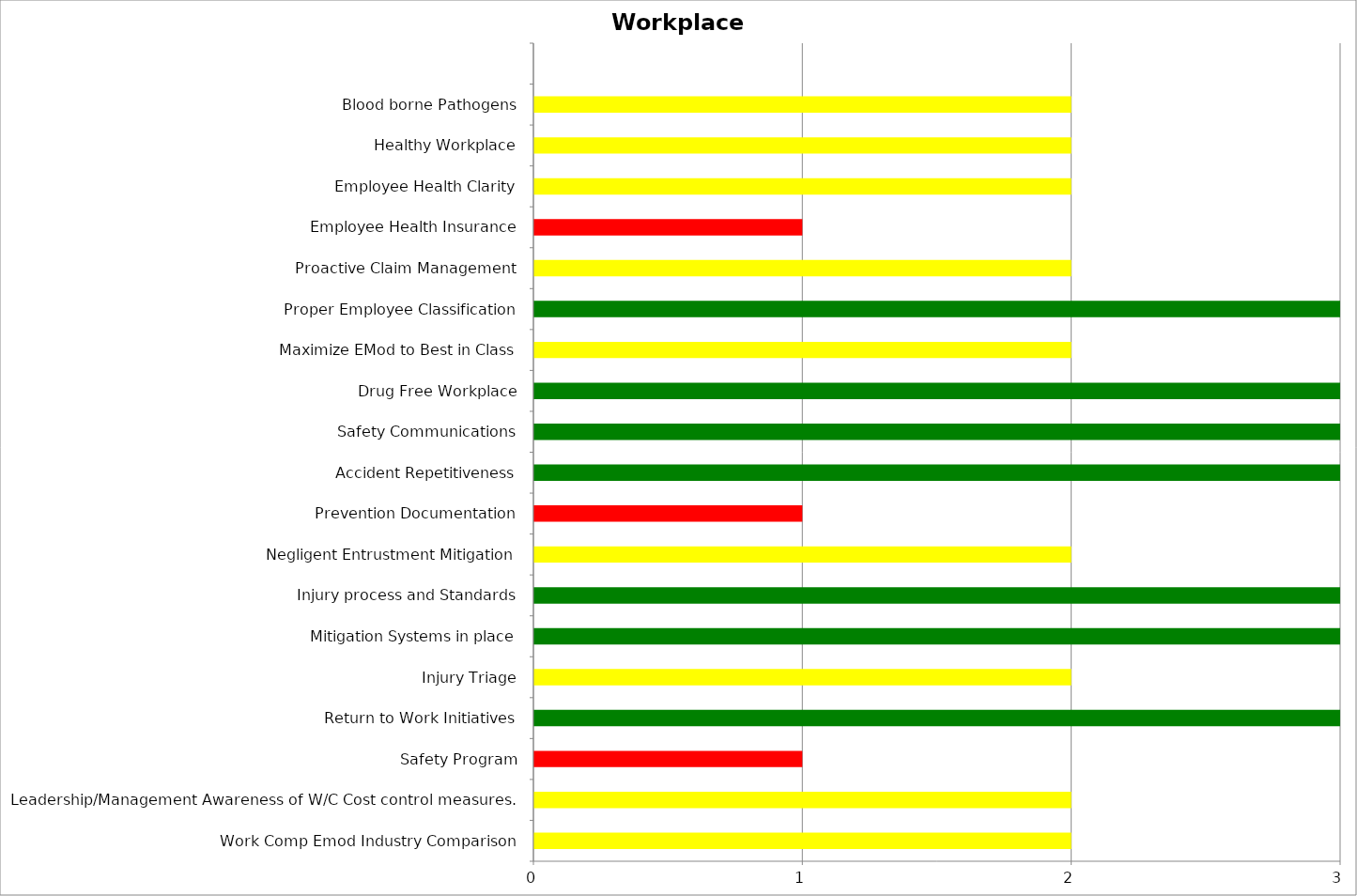
| Category | Low | Medium | High |
|---|---|---|---|
| Work Comp Emod Industry Comparison | 0 | 2 | 0 |
| Leadership/Management Awareness of W/C Cost control measures. | 0 | 2 | 0 |
| Safety Program | 0 | 0 | 1 |
| Return to Work Initiatives | 3 | 0 | 0 |
| Injury Triage | 0 | 2 | 0 |
| Mitigation Systems in place | 3 | 0 | 0 |
| Injury process and Standards | 3 | 0 | 0 |
| Negligent Entrustment Mitigation | 0 | 2 | 0 |
| Prevention Documentation | 0 | 0 | 1 |
| Accident Repetitiveness | 3 | 0 | 0 |
| Safety Communications | 3 | 0 | 0 |
| Drug Free Workplace | 3 | 0 | 0 |
| Maximize EMod to Best in Class | 0 | 2 | 0 |
| Proper Employee Classification | 3 | 0 | 0 |
| Proactive Claim Management | 0 | 2 | 0 |
| Employee Health Insurance | 0 | 0 | 1 |
| Employee Health Clarity | 0 | 2 | 0 |
| Healthy Workplace | 0 | 2 | 0 |
| Blood borne Pathogens | 0 | 2 | 0 |